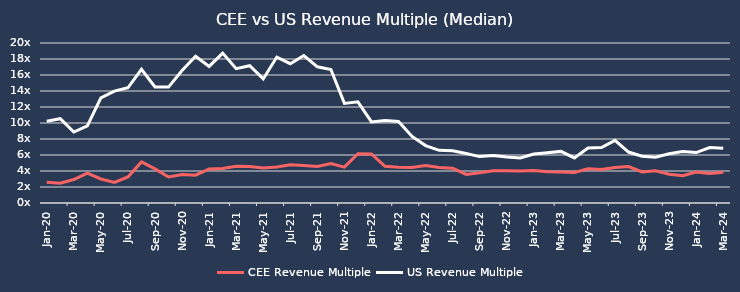
| Category | CEE Revenue Multiple | US Revenue Multiple |
|---|---|---|
| 2020-01-31 | 2.581 | 10.22 |
| 2020-02-29 | 2.473 | 10.54 |
| 2020-03-31 | 2.929 | 8.87 |
| 2020-04-30 | 3.744 | 9.64 |
| 2020-05-31 | 3.002 | 13.15 |
| 2020-06-30 | 2.57 | 13.98 |
| 2020-07-31 | 3.259 | 14.4 |
| 2020-08-31 | 5.128 | 16.71 |
| 2020-09-30 | 4.268 | 14.5 |
| 2020-10-31 | 3.258 | 14.49 |
| 2020-11-30 | 3.559 | 16.56 |
| 2020-12-31 | 3.476 | 18.34 |
| 2021-01-31 | 4.256 | 17.07 |
| 2021-02-28 | 4.309 | 18.74 |
| 2021-03-31 | 4.602 | 16.79 |
| 2021-04-30 | 4.56 | 17.16 |
| 2021-05-31 | 4.373 | 15.51 |
| 2021-06-30 | 4.513 | 18.24 |
| 2021-07-31 | 4.79 | 17.41 |
| 2021-08-31 | 4.701 | 18.43 |
| 2021-09-30 | 4.559 | 17.02 |
| 2021-10-31 | 4.935 | 16.69 |
| 2021-11-30 | 4.481 | 12.45 |
| 2021-12-31 | 6.168 | 12.65 |
| 2022-01-31 | 6.134 | 10.14 |
| 2022-02-28 | 4.58 | 10.3 |
| 2022-03-31 | 4.457 | 10.2 |
| 2022-04-30 | 4.452 | 8.32 |
| 2022-05-31 | 4.687 | 7.18 |
| 2022-06-30 | 4.433 | 6.58 |
| 2022-07-31 | 4.347 | 6.54 |
| 2022-08-31 | 3.572 | 6.18 |
| 2022-09-30 | 3.785 | 5.8 |
| 2022-10-31 | 4.042 | 5.94 |
| 2022-11-30 | 4.035 | 5.76 |
| 2022-12-31 | 4.008 | 5.64 |
| 2023-01-31 | 4.068 | 6.12 |
| 2023-02-28 | 3.916 | 6.27 |
| 2023-03-31 | 3.862 | 6.45 |
| 2023-04-30 | 3.819 | 5.63 |
| 2023-05-31 | 4.275 | 6.88 |
| 2023-06-30 | 4.178 | 6.93 |
| 2023-07-31 | 4.429 | 7.83 |
| 2023-08-31 | 4.548 | 6.37 |
| 2023-09-30 | 3.887 | 5.84 |
| 2023-10-31 | 4.039 | 5.72 |
| 2023-11-30 | 3.591 | 6.15 |
| 2023-12-31 | 3.398 | 6.44 |
| 2024-01-31 | 3.861 | 6.3 |
| 2024-02-29 | 3.698 | 6.94 |
| 2024-03-31 | 3.851 | 6.84 |